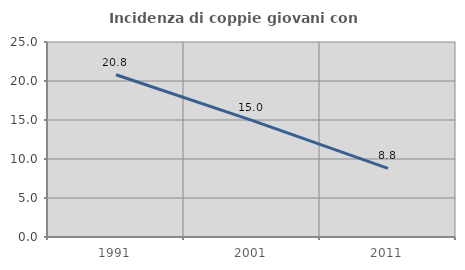
| Category | Incidenza di coppie giovani con figli |
|---|---|
| 1991.0 | 20.798 |
| 2001.0 | 14.961 |
| 2011.0 | 8.8 |